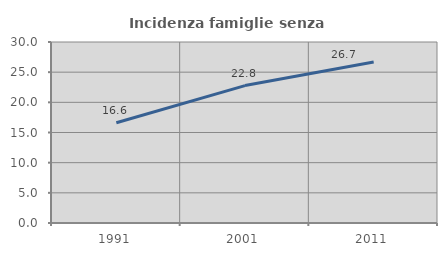
| Category | Incidenza famiglie senza nuclei |
|---|---|
| 1991.0 | 16.618 |
| 2001.0 | 22.775 |
| 2011.0 | 26.698 |